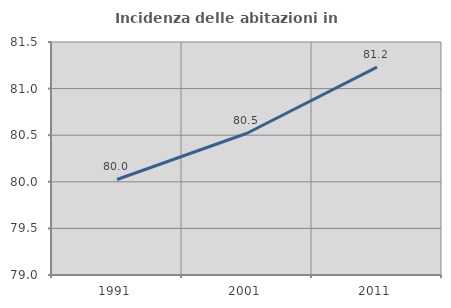
| Category | Incidenza delle abitazioni in proprietà  |
|---|---|
| 1991.0 | 80.025 |
| 2001.0 | 80.521 |
| 2011.0 | 81.23 |